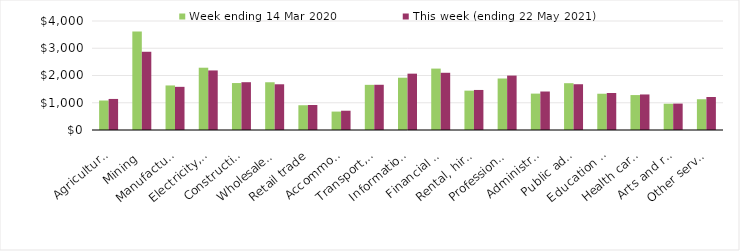
| Category | Week ending 14 Mar 2020 | This week (ending 22 May 2021) |
|---|---|---|
| Agriculture, forestry and fishing | 1082.23 | 1139.9 |
| Mining | 3610.56 | 2870.86 |
| Manufacturing | 1634.91 | 1583.63 |
| Electricity, gas, water and waste services | 2285.61 | 2185.43 |
| Construction | 1723.14 | 1753.94 |
| Wholesale trade | 1751.93 | 1677.92 |
| Retail trade | 908.66 | 917.76 |
| Accommodation and food services | 675.87 | 707.56 |
| Transport, postal and warehousing | 1657.27 | 1659.78 |
| Information media and telecommunications | 1918.45 | 2067.7 |
| Financial and insurance services | 2253.77 | 2099.89 |
| Rental, hiring and real estate services | 1444.16 | 1469.51 |
| Professional, scientific and technical services | 1889.71 | 1996.9 |
| Administrative and support services | 1335.61 | 1412.25 |
| Public administration and safety | 1717.6 | 1679.49 |
| Education and training | 1330.82 | 1357.98 |
| Health care and social assistance | 1281.98 | 1304.11 |
| Arts and recreation services | 964.13 | 969.1 |
| Other services | 1128.87 | 1210.5 |